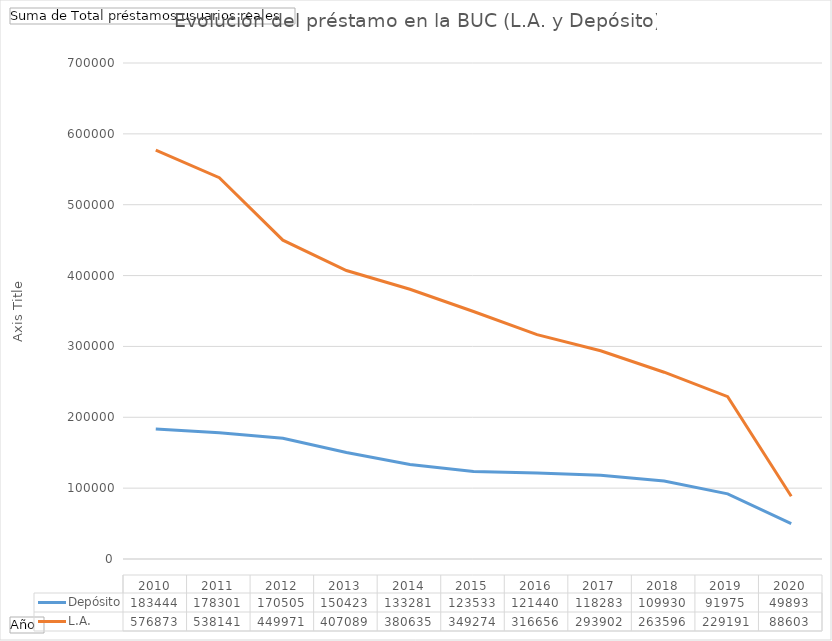
| Category | Depósito | L.A. |
|---|---|---|
| 2010 | 183444 | 576873 |
| 2011 | 178301 | 538141 |
| 2012 | 170505 | 449971 |
| 2013 | 150423 | 407089 |
| 2014 | 133281 | 380635 |
| 2015 | 123533 | 349274 |
| 2016 | 121440 | 316656 |
| 2017 | 118283 | 293902 |
| 2018 | 109930 | 263596 |
| 2019 | 91975 | 229191 |
| 2020 | 49893 | 88603 |